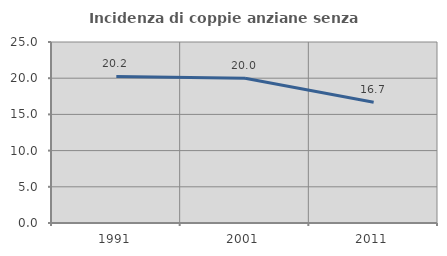
| Category | Incidenza di coppie anziane senza figli  |
|---|---|
| 1991.0 | 20.238 |
| 2001.0 | 20 |
| 2011.0 | 16.667 |